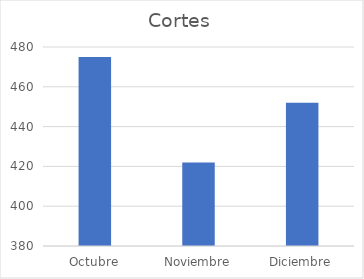
| Category | Cortes |
|---|---|
| Octubre | 475 |
| Noviembre | 422 |
| Diciembre | 452 |